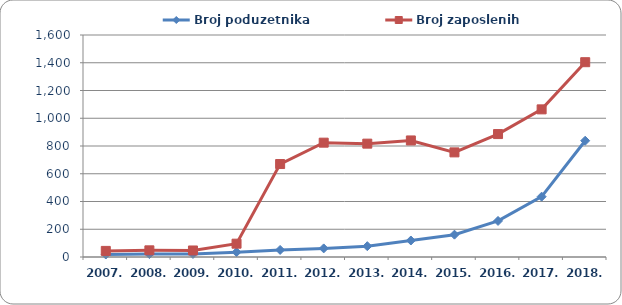
| Category | Broj poduzetnika  | Broj zaposlenih  |
|---|---|---|
| 2007. | 18 | 44 |
| 2008. | 21 | 48 |
| 2009. | 22 | 47 |
| 2010. | 35 | 96 |
| 2011. | 51 | 670 |
| 2012. | 62 | 824 |
| 2013. | 78 | 817 |
| 2014. | 119 | 840 |
| 2015. | 161 | 754 |
| 2016. | 260 | 886 |
| 2017. | 435 | 1064 |
| 2018. | 838 | 1404 |